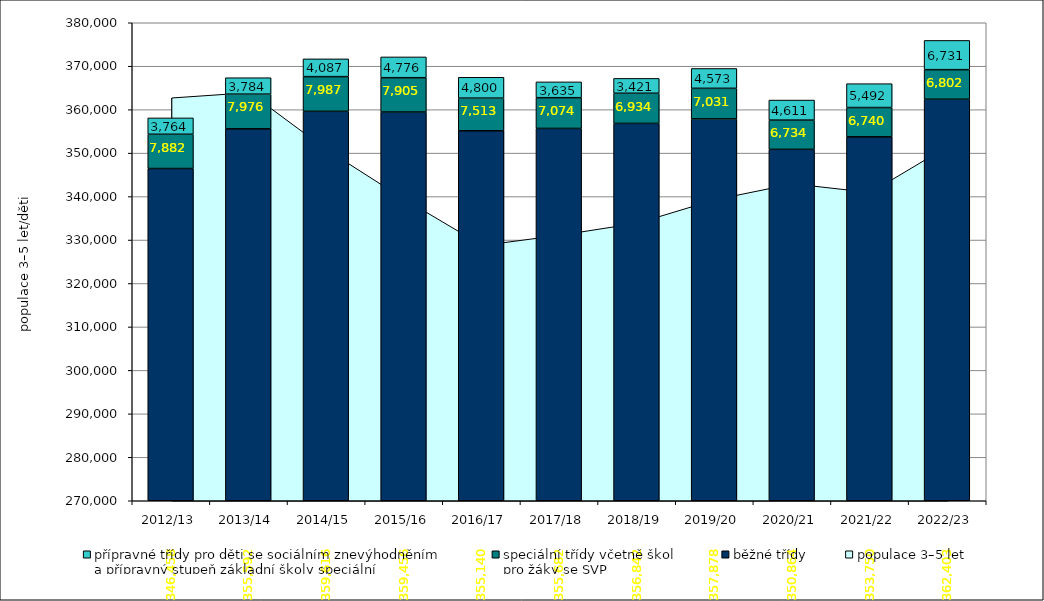
| Category | běžné třídy | speciální třídy včetně škol
pro žáky se SVP | přípravné třídy pro děti se sociálním znevýhodněním
a přípravný stupeň základní školy speciální |
|---|---|---|---|
| 2012/13 | 346458 | 7882 | 3764 |
| 2013/14 | 355592 | 7976 | 3784 |
| 2014/15 | 359616 | 7987 | 4087 |
| 2015/16 | 359456 | 7905 | 4776 |
| 2016/17 | 355140 | 7513 | 4800 |
| 2017/18 | 355682 | 7074 | 3635 |
| 2018/19 | 356842 | 6934 | 3421 |
| 2019/20 | 357878 | 7031 | 4573 |
| 2020/21 | 350864 | 6734 | 4611 |
| 2021/22 | 353750 | 6740 | 5492 |
| 2022/23 | 362403 | 6802 | 6731 |